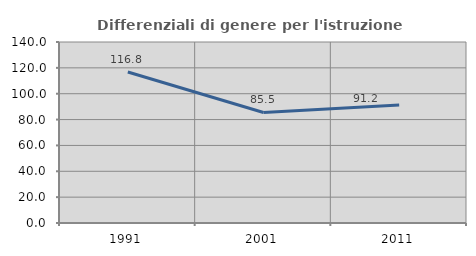
| Category | Differenziali di genere per l'istruzione superiore |
|---|---|
| 1991.0 | 116.843 |
| 2001.0 | 85.496 |
| 2011.0 | 91.217 |